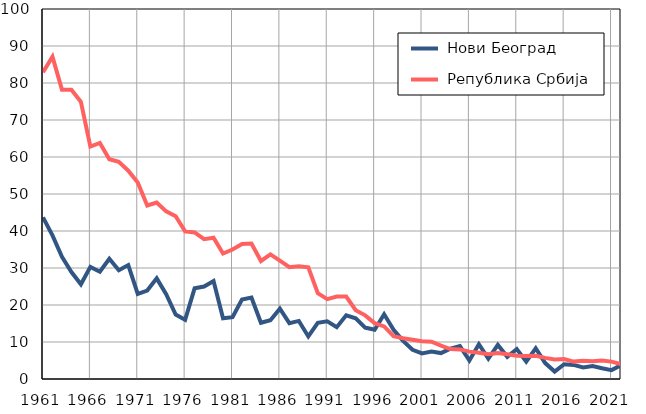
| Category |  Нови Београд |  Република Србија |
|---|---|---|
| 1961.0 | 43.7 | 82.9 |
| 1962.0 | 38.8 | 87.1 |
| 1963.0 | 33 | 78.2 |
| 1964.0 | 28.9 | 78.2 |
| 1965.0 | 25.6 | 74.9 |
| 1966.0 | 30.3 | 62.8 |
| 1967.0 | 29 | 63.8 |
| 1968.0 | 32.5 | 59.4 |
| 1969.0 | 29.4 | 58.7 |
| 1970.0 | 30.8 | 56.3 |
| 1971.0 | 23 | 53.1 |
| 1972.0 | 23.9 | 46.9 |
| 1973.0 | 27.2 | 47.7 |
| 1974.0 | 22.9 | 45.3 |
| 1975.0 | 17.4 | 44 |
| 1976.0 | 16 | 39.9 |
| 1977.0 | 24.5 | 39.6 |
| 1978.0 | 25 | 37.8 |
| 1979.0 | 26.5 | 38.2 |
| 1980.0 | 16.4 | 33.9 |
| 1981.0 | 16.7 | 35 |
| 1982.0 | 21.5 | 36.5 |
| 1983.0 | 22 | 36.6 |
| 1984.0 | 15.2 | 31.9 |
| 1985.0 | 15.9 | 33.7 |
| 1986.0 | 19 | 32 |
| 1987.0 | 15.1 | 30.2 |
| 1988.0 | 15.7 | 30.5 |
| 1989.0 | 11.5 | 30.2 |
| 1990.0 | 15.2 | 23.2 |
| 1991.0 | 15.6 | 21.6 |
| 1992.0 | 14 | 22.3 |
| 1993.0 | 17.2 | 22.3 |
| 1994.0 | 16.4 | 18.6 |
| 1995.0 | 13.9 | 17.2 |
| 1996.0 | 13.3 | 15.1 |
| 1997.0 | 17.5 | 14.2 |
| 1998.0 | 13.3 | 11.6 |
| 1999.0 | 10.3 | 11 |
| 2000.0 | 7.9 | 10.6 |
| 2001.0 | 6.9 | 10.2 |
| 2002.0 | 7.4 | 10.1 |
| 2003.0 | 7 | 9 |
| 2004.0 | 8.2 | 8.1 |
| 2005.0 | 8.9 | 8 |
| 2006.0 | 5 | 7.4 |
| 2007.0 | 9.4 | 7.1 |
| 2008.0 | 5.5 | 6.7 |
| 2009.0 | 9.2 | 7 |
| 2010.0 | 6 | 6.7 |
| 2011.0 | 8.1 | 6.3 |
| 2012.0 | 4.7 | 6.2 |
| 2013.0 | 8.3 | 6.3 |
| 2014.0 | 4.3 | 5.7 |
| 2015.0 | 2 | 5.3 |
| 2016.0 | 4 | 5.4 |
| 2017.0 | 3.8 | 4.7 |
| 2018.0 | 3.1 | 4.9 |
| 2019.0 | 3.5 | 4.8 |
| 2020.0 | 2.9 | 5 |
| 2021.0 | 2.4 | 4.7 |
| 2022.0 | 3.7 | 4 |